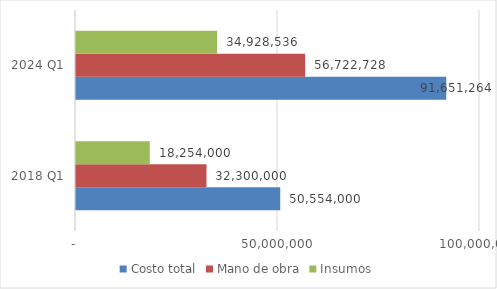
| Category | Costo total | Mano de obra | Insumos |
|---|---|---|---|
| 2018 Q1 | 50554000 | 32300000 | 18254000 |
| 2024 Q1 | 91651263.699 | 56722728 | 34928535.699 |